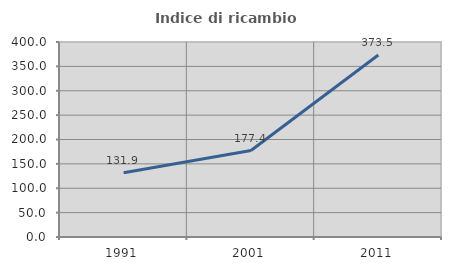
| Category | Indice di ricambio occupazionale  |
|---|---|
| 1991.0 | 131.881 |
| 2001.0 | 177.366 |
| 2011.0 | 373.469 |